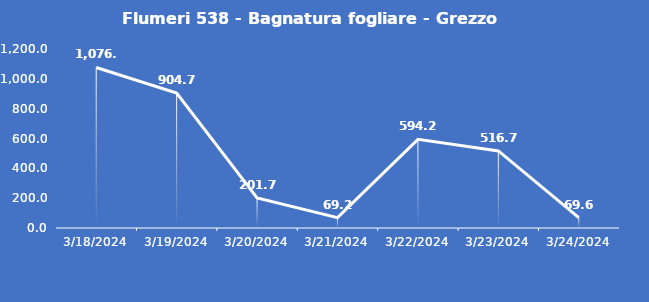
| Category | Flumeri 538 - Bagnatura fogliare - Grezzo (min) |
|---|---|
| 3/18/24 | 1076.1 |
| 3/19/24 | 904.7 |
| 3/20/24 | 201.7 |
| 3/21/24 | 69.2 |
| 3/22/24 | 594.2 |
| 3/23/24 | 516.7 |
| 3/24/24 | 69.6 |